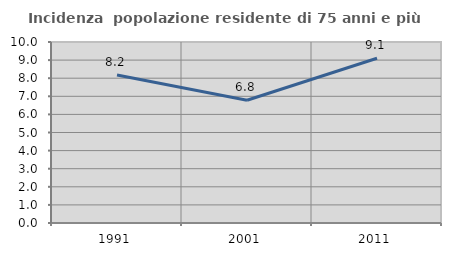
| Category | Incidenza  popolazione residente di 75 anni e più |
|---|---|
| 1991.0 | 8.173 |
| 2001.0 | 6.78 |
| 2011.0 | 9.1 |